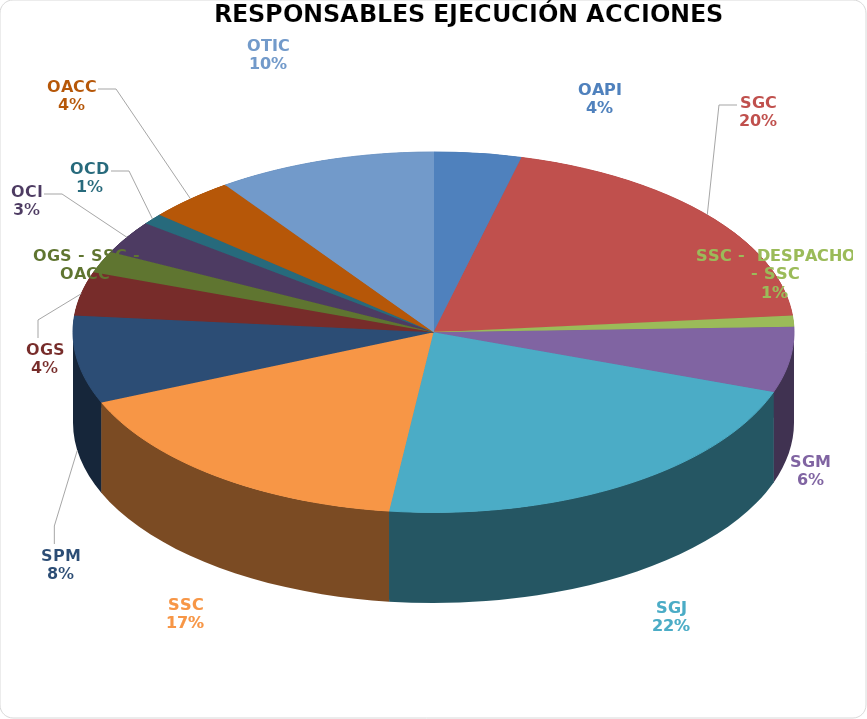
| Category | Series 0 |
|---|---|
| OAPI | 4 |
| SGC | 20 |
| SSC -  DESPACHO - SSC | 1 |
| SGM | 6 |
| SGJ | 22 |
| SSC | 17 |
| SPM | 8 |
| OGS | 4 |
| OGS - SSC - OACC | 2 |
| OCI | 3 |
| OCD | 1 |
| OACC | 4 |
| OTIC | 10 |